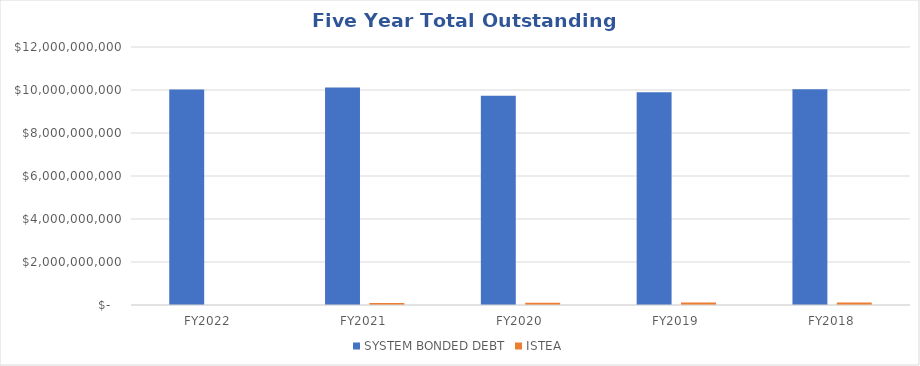
| Category | SYSTEM BONDED DEBT | ISTEA |
|---|---|---|
| FY2022 | 10019266548 | 0 |
| FY2021 | 10116437384 | 91289967 |
| FY2020 | 9727863864 | 102315128 |
| FY2019 | 9897258875 | 112895896 |
| FY2018 | 10036671622 | 120101628 |